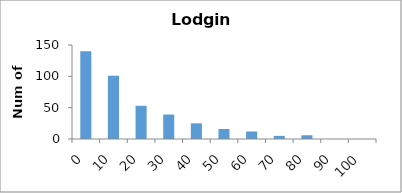
| Category | Series 0 |
|---|---|
| 0.0 | 140 |
| 10.0 | 101 |
| 20.0 | 53 |
| 30.0 | 39 |
| 40.0 | 25 |
| 50.0 | 16 |
| 60.0 | 12 |
| 70.0 | 5 |
| 80.0 | 6 |
| 90.0 | 0 |
| 100.0 | 0 |